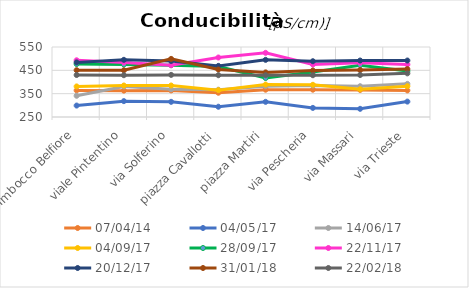
| Category | 07/04/14 | 04/05/17 | 14/06/17 | 04/09/17 | 28/09/17 | 22/11/17 | 20/12/17 | 31/01/18 | 22/02/18 |
|---|---|---|---|---|---|---|---|---|---|
| Imbocco Belfiore | 364 | 299 | 341 | 381 | 477 | 493 | 484 | 450.5 | 429.9 |
| viale Pintentino | 363 | 318 | 381 | 385 | 475 | 484 | 495 | 450.1 | 429.1 |
| via Solferino | 364 | 315 | 369 | 385 | 472 | 472 | 490 | 499 | 430.5 |
| piazza Cavallotti | 354 | 294 | 367 | 365 | 466 | 505 | 469 | 453.3 | 429 |
| piazza Martiri | 367 | 315 | 382 | 389 | 417 | 525 | 495 | 441.2 | 429 |
| via Pescheria | 367 | 289 | 385 | 388 | 443 | 475 | 489 | 449.3 | 429 |
| via Massari | 366 | 285 | 382 | 369 | 472 | 483 | 492 | 451.3 | 430 |
| via Trieste | 364 | 316 | 392 | 382 | 447 | 475 | 492 | 455.5 | 437 |